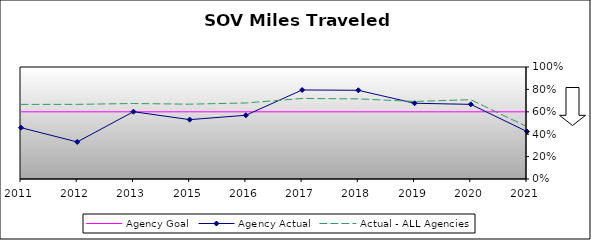
| Category | Agency Goal | Agency Actual | Actual - ALL Agencies |
|---|---|---|---|
| 2011.0 | 0.6 | 0.458 | 0.666 |
| 2012.0 | 0.6 | 0.331 | 0.666 |
| 2013.0 | 0.6 | 0.601 | 0.674 |
| 2015.0 | 0.6 | 0.53 | 0.668 |
| 2016.0 | 0.6 | 0.569 | 0.679 |
| 2017.0 | 0.6 | 0.795 | 0.719 |
| 2018.0 | 0.6 | 0.792 | 0.715 |
| 2019.0 | 0.6 | 0.676 | 0.692 |
| 2020.0 | 0.6 | 0.666 | 0.708 |
| 2021.0 | 0.6 | 0.424 | 0.467 |